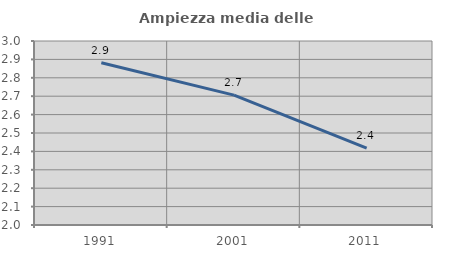
| Category | Ampiezza media delle famiglie |
|---|---|
| 1991.0 | 2.882 |
| 2001.0 | 2.706 |
| 2011.0 | 2.418 |